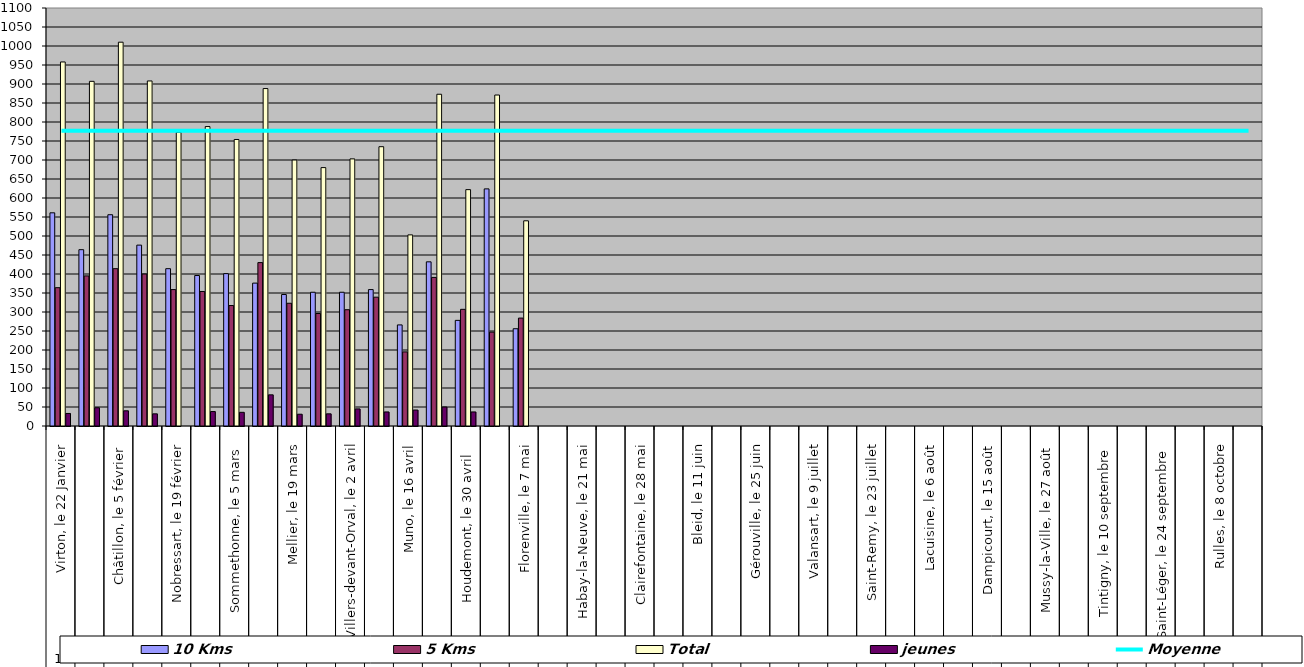
| Category | 10 Kms | 5 Kms | Total | jeunes |
|---|---|---|---|---|
| 0 | 561 | 364 | 958 | 33 |
| 1 | 464 | 395 | 907 | 48 |
| 2 | 556 | 414 | 1010 | 40 |
| 3 | 476 | 400 | 908 | 32 |
| 4 | 414 | 359 | 773 | 0 |
| 5 | 396 | 354 | 788 | 38 |
| 6 | 401 | 317 | 754 | 36 |
| 7 | 376 | 430 | 888 | 82 |
| 8 | 346 | 323 | 700 | 31 |
| 9 | 352 | 296 | 680 | 32 |
| 10 | 352 | 306 | 703 | 45 |
| 11 | 359 | 339 | 735 | 37 |
| 12 | 266 | 195 | 503 | 42 |
| 13 | 432 | 391 | 873 | 50 |
| 14 | 278 | 307 | 622 | 37 |
| 15 | 624 | 247 | 871 | 0 |
| 16 | 256 | 284 | 540 | 0 |
| 17 | 0 | 0 | 0 | 0 |
| 18 | 0 | 0 | 0 | 0 |
| 19 | 0 | 0 | 0 | 0 |
| 20 | 0 | 0 | 0 | 0 |
| 21 | 0 | 0 | 0 | 0 |
| 22 | 0 | 0 | 0 | 0 |
| 23 | 0 | 0 | 0 | 0 |
| 24 | 0 | 0 | 0 | 0 |
| 25 | 0 | 0 | 0 | 0 |
| 26 | 0 | 0 | 0 | 0 |
| 27 | 0 | 0 | 0 | 0 |
| 28 | 0 | 0 | 0 | 0 |
| 29 | 0 | 0 | 0 | 0 |
| 30 | 0 | 0 | 0 | 0 |
| 31 | 0 | 0 | 0 | 0 |
| 32 | 0 | 0 | 0 | 0 |
| 33 | 0 | 0 | 0 | 0 |
| 34 | 0 | 0 | 0 | 0 |
| 35 | 0 | 0 | 0 | 0 |
| 36 | 0 | 0 | 0 | 0 |
| 37 | 0 | 0 | 0 | 0 |
| 38 | 0 | 0 | 0 | 0 |
| 39 | 0 | 0 | 0 | 0 |
| 40 | 0 | 0 | 0 | 0 |
| 41 | 0 | 0 | 0 | 0 |